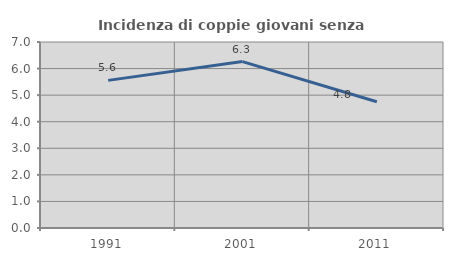
| Category | Incidenza di coppie giovani senza figli |
|---|---|
| 1991.0 | 5.556 |
| 2001.0 | 6.263 |
| 2011.0 | 4.752 |